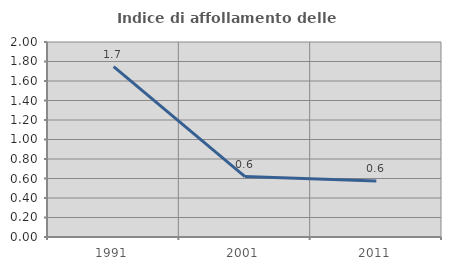
| Category | Indice di affollamento delle abitazioni  |
|---|---|
| 1991.0 | 1.748 |
| 2001.0 | 0.62 |
| 2011.0 | 0.576 |